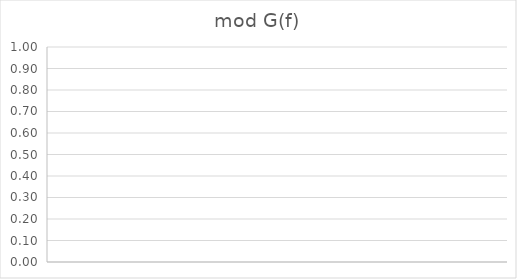
| Category | mod G(f) |
|---|---|
|  | 1 |
|  | 1 |
|  | 1 |
|  | 1 |
|  | 1 |
|  | 1 |
|  | 1 |
|  | 1 |
|  | 1 |
|  | 1 |
|  | 1 |
|  | 1 |
|  | 1 |
|  | 1 |
|  | 1 |
|  | 1 |
|  | 1 |
|  | 1 |